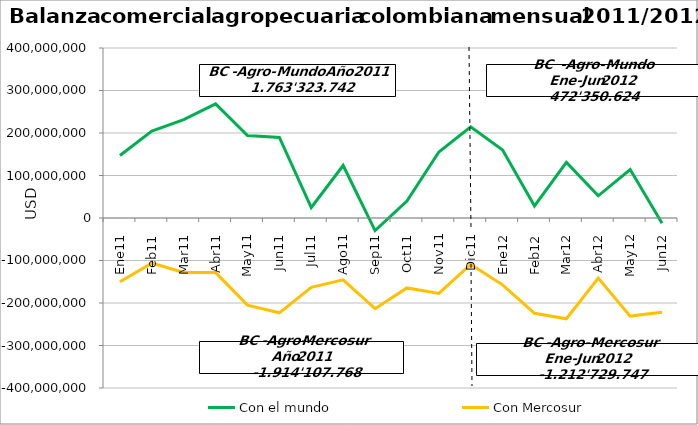
| Category | Con el mundo | Con Mercosur |
|---|---|---|
| 0 | 147170268.9 | -149993489.35 |
| 1 | 204650116.66 | -106087631.7 |
| 2 | 231423347.81 | -128006348.79 |
| 3 | 268381287.56 | -128474550.33 |
| 4 | 193958950.79 | -204947186.97 |
| 5 | 189518018.45 | -223118008.64 |
| 6 | 24694762.16 | -163141525.53 |
| 7 | 123602889.05 | -145660633.21 |
| 8 | -29681100.27 | -213354347.24 |
| 9 | 39906361.62 | -164588306.57 |
| 10 | 155339935.17 | -177399849.08 |
| 11 | 214358903.69 | -109335890.76 |
| 12 | 159718811.51 | -157312233.06 |
| 13 | 28364992.2 | -224198084.51 |
| 14 | 130703935.59 | -237169939.67 |
| 15 | 52247887.52 | -141500161.52 |
| 16 | 113869665.14 | -230815185.93 |
| 17 | -12554667.46 | -221734142.71 |